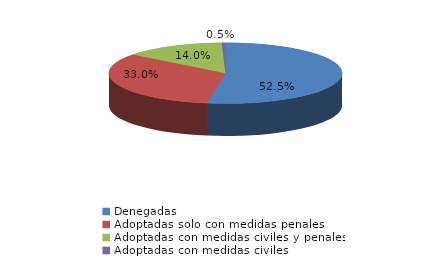
| Category | Series 0 |
|---|---|
| Denegadas | 301 |
| Adoptadas solo con medidas penales | 189 |
| Adoptadas con medidas civiles y penales | 80 |
| Adoptadas con medidas civiles | 3 |